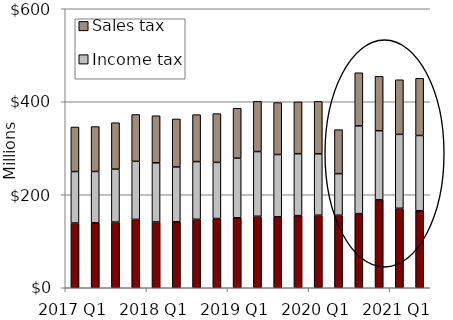
| Category | Property tax | Income tax | Sales tax |
|---|---|---|---|
| 2017 Q1 | 139257 | 110624 | 95817 |
| 2017 Q2 | 139874 | 110254 | 96516 |
| 2017 Q3 | 141248 | 113797 | 99911 |
| 2017 Q4 | 147056 | 124839 | 100700 |
| 2018 Q1 | 141527 | 127171 | 101264 |
| 2018 Q2 | 141885 | 117889 | 103232 |
| 2018 Q3 | 147247 | 124042 | 101044 |
| 2018 Q4 | 148867 | 120784 | 104848 |
| 2019 Q1 | 150525 | 128048 | 107482 |
| 2019 Q2 | 153715 | 139222 | 107993 |
| 2019 Q3 | 152576 | 133988 | 111653 |
| 2019 Q4 | 155042 | 133289 | 111292 |
| 2020 Q1 | 155994 | 132077 | 112762 |
| 2020 Q2 | 156011 | 89371 | 94619 |
| 2020 Q3 | 159393 | 188741 | 114244 |
| 2020 Q4 | 189059 | 148680 | 116981 |
| 2021 Q1 | 170942 | 158970 | 117411 |
| 2021 Q2 | 165702 | 161685 | 123036 |